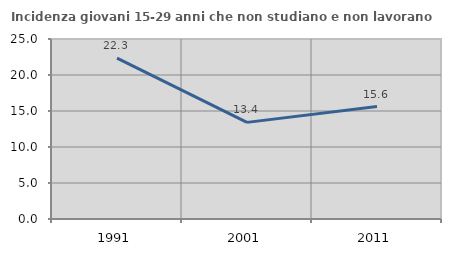
| Category | Incidenza giovani 15-29 anni che non studiano e non lavorano  |
|---|---|
| 1991.0 | 22.336 |
| 2001.0 | 13.419 |
| 2011.0 | 15.612 |